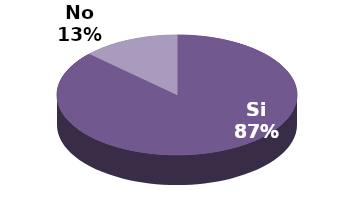
| Category | Series 1 |
|---|---|
| Si | 20 |
| No | 3 |